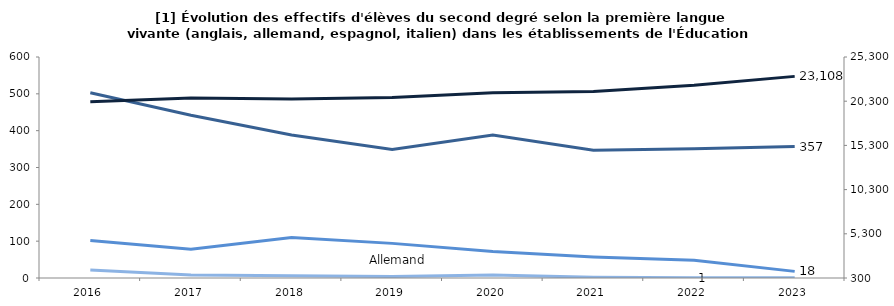
| Category | Italien | Espagnol | Allemand |
|---|---|---|---|
| 2016 | 503 | 102 | 22 |
| 2017 | 442 | 78 | 8 |
| 2018 | 388 | 110 | 6 |
| 2019 | 349 | 94 | 4 |
| 2020 | 388 | 72 | 8 |
| 2021 | 347 | 57 | 2 |
| 2022 | 351 | 48 | 1 |
| 2023 | 357 | 18 | 1 |